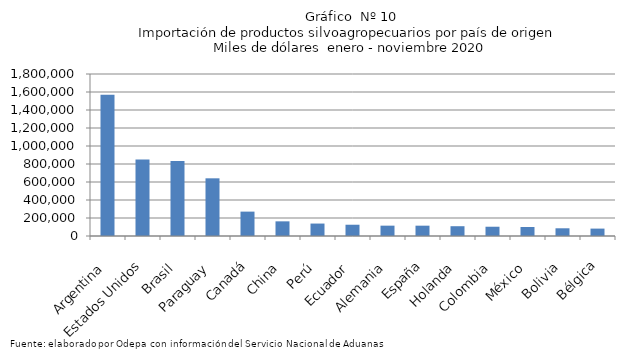
| Category | Series 0 |
|---|---|
| Argentina | 1569783.44 |
| Estados Unidos | 848822.176 |
| Brasil | 834631.068 |
| Paraguay | 640954.879 |
| Canadá | 270924.246 |
| China | 162858.938 |
| Perú | 138275.844 |
| Ecuador | 125229.065 |
| Alemania | 114900.965 |
| España | 114707.504 |
| Holanda | 108801.484 |
| Colombia | 103026.049 |
| México | 99794.584 |
| Bolivia | 85667.472 |
| Bélgica | 82207.327 |